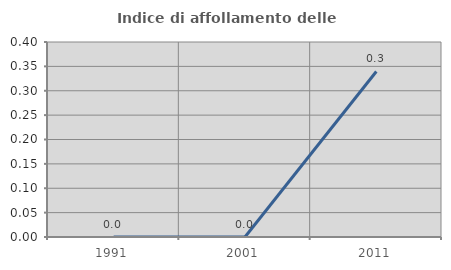
| Category | Indice di affollamento delle abitazioni  |
|---|---|
| 1991.0 | 0 |
| 2001.0 | 0 |
| 2011.0 | 0.34 |